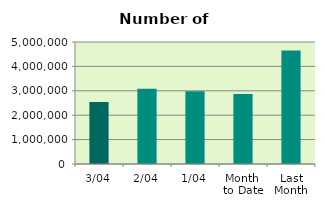
| Category | Series 0 |
|---|---|
| 3/04 | 2542980 |
| 2/04 | 3083644 |
| 1/04 | 2981902 |
| Month 
to Date | 2869508.667 |
| Last
Month | 4654844.727 |